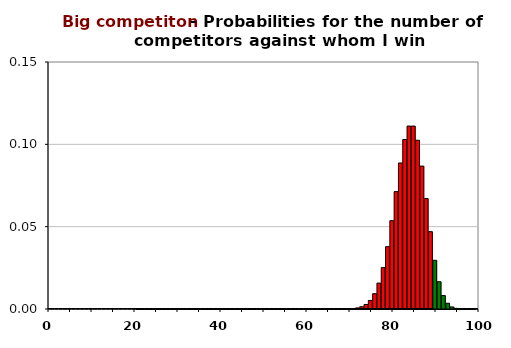
| Category | do not get the prize | 0,85 | 99 | 0,06 |
|---|---|---|---|---|
| 0.0 | 0 | 0 | 0 | -1 |
| 1.0 | 0 | 0 | 0 | -1 |
| 2.0 | 0 | 0 | 0 | -1 |
| 3.0 | 0 | 0 | 0 | -1 |
| 4.0 | 0 | 0 | 0 | -1 |
| 5.0 | 0 | 0 | 0 | -1 |
| 6.0 | 0 | 0 | 0 | -1 |
| 7.0 | 0 | 0 | 0 | -1 |
| 8.0 | 0 | 0 | 0 | -1 |
| 9.0 | 0 | 0 | 0 | -1 |
| 10.0 | 0 | 0 | 0 | -1 |
| 11.0 | 0 | 0 | 0 | -1 |
| 12.0 | 0 | 0 | 0 | -1 |
| 13.0 | 0 | 0 | 0 | -1 |
| 14.0 | 0 | 0 | 0 | -1 |
| 15.0 | 0 | 0 | 0 | -1 |
| 16.0 | 0 | 0 | 0 | -1 |
| 17.0 | 0 | 0 | 0 | -1 |
| 18.0 | 0 | 0 | 0 | -1 |
| 19.0 | 0 | 0 | 0 | -1 |
| 20.0 | 0 | 0 | 0 | -1 |
| 21.0 | 0 | 0 | 0 | -1 |
| 22.0 | 0 | 0 | 0 | -1 |
| 23.0 | 0 | 0 | 0 | -1 |
| 24.0 | 0 | 0 | 0 | -1 |
| 25.0 | 0 | 0 | 0 | -1 |
| 26.0 | 0 | 0 | 0 | -1 |
| 27.0 | 0 | 0 | 0 | -1 |
| 28.0 | 0 | 0 | 0 | -1 |
| 29.0 | 0 | 0 | 0 | -1 |
| 30.0 | 0 | 0 | 0 | -1 |
| 31.0 | 0 | 0 | 0 | -1 |
| 32.0 | 0 | 0 | 0 | -1 |
| 33.0 | 0 | 0 | 0 | -1 |
| 34.0 | 0 | 0 | 0 | -1 |
| 35.0 | 0 | 0 | 0 | -1 |
| 36.0 | 0 | 0 | 0 | -1 |
| 37.0 | 0 | 0 | 0 | -1 |
| 38.0 | 0 | 0 | 0 | -1 |
| 39.0 | 0 | 0 | 0 | -1 |
| 40.0 | 0 | 0 | 0 | -1 |
| 41.0 | 0 | 0 | 0 | -1 |
| 42.0 | 0 | 0 | 0 | -1 |
| 43.0 | 0 | 0 | 0 | -1 |
| 44.0 | 0 | 0 | 0 | -1 |
| 45.0 | 0 | 0 | 0 | -1 |
| 46.0 | 0 | 0 | 0 | -1 |
| 47.0 | 0 | 0 | 0 | -1 |
| 48.0 | 0 | 0 | 0 | -1 |
| 49.0 | 0 | 0 | 0 | -1 |
| 50.0 | 0 | 0 | 0 | -1 |
| 51.0 | 0 | 0 | 0 | -1 |
| 52.0 | 0 | 0 | 0 | -1 |
| 53.0 | 0 | 0 | 0 | -1 |
| 54.0 | 0 | 0 | 0 | -1 |
| 55.0 | 0 | 0 | 0 | -1 |
| 56.0 | 0 | 0 | 0 | -1 |
| 57.0 | 0 | 0 | 0 | -1 |
| 58.0 | 0 | 0 | 0 | -1 |
| 59.0 | 0 | 0 | 0 | -1 |
| 60.0 | 0 | 0 | 0 | -1 |
| 61.0 | 0 | 0 | 0 | -1 |
| 62.0 | 0 | 0 | 0 | -1 |
| 63.0 | 0 | 0 | 0 | -1 |
| 64.0 | 0 | 0 | 0 | -1 |
| 65.0 | 0 | 0 | 0 | -1 |
| 66.0 | 0 | 0 | 0 | -1 |
| 67.0 | 0 | 0 | 0 | -1 |
| 68.0 | 0 | 0 | 0 | -1 |
| 69.0 | 0 | 0 | 0 | -1 |
| 70.0 | 0 | 0 | 0 | -1 |
| 71.0 | 0 | 0 | 0 | -1 |
| 72.0 | 0.001 | 0 | 0 | -1 |
| 73.0 | 0.001 | 0 | 0 | -1 |
| 74.0 | 0.003 | 0 | 0 | -1 |
| 75.0 | 0.005 | 0 | 0 | -1 |
| 76.0 | 0.009 | 0 | 0 | -1 |
| 77.0 | 0.016 | 0 | 0 | -1 |
| 78.0 | 0.025 | 0 | 0 | -1 |
| 79.0 | 0.038 | 0 | 0 | -1 |
| 80.0 | 0.054 | 0 | 0 | -1 |
| 81.0 | 0.071 | 0 | 0 | -1 |
| 82.0 | 0.089 | 0 | 0 | -1 |
| 83.0 | 0.103 | 0 | 0 | -1 |
| 84.0 | 0.111 | 0 | 0 | -1 |
| 85.0 | 0.111 | 0 | 0 | -1 |
| 86.0 | 0.102 | 0 | 0 | -1 |
| 87.0 | 0.087 | 0 | 0 | -1 |
| 88.0 | 0.067 | 0 | 0 | -1 |
| 89.0 | 0.047 | 0 | 0 | -1 |
| 90.0 | -1 | 0 | 0 | 0.03 |
| 91.0 | -1 | 0 | 0 | 0.017 |
| 92.0 | -1 | 0 | 0 | 0.008 |
| 93.0 | -1 | 0 | 0 | 0.003 |
| 94.0 | -1 | 0 | 0 | 0.001 |
| 95.0 | -1 | 0 | 0 | 0 |
| 96.0 | -1 | 0 | 0 | 0 |
| 97.0 | -1 | 0 | 0 | 0 |
| 98.0 | -1 | 0 | 0 | 0 |
| 99.0 | -1 | 0 | 0 | 0 |
| 100.0 | -1 | 0 | 0 | 0 |